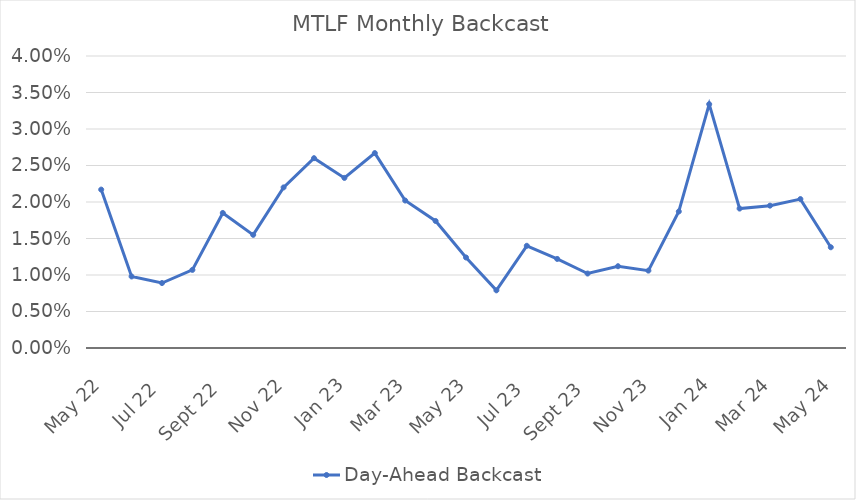
| Category | Day-Ahead Backcast |
|---|---|
| 2022-05-20 | 0.022 |
| 2022-06-20 | 0.01 |
| 2022-07-20 | 0.009 |
| 2022-08-20 | 0.011 |
| 2022-09-20 | 0.018 |
| 2022-10-20 | 0.016 |
| 2022-11-20 | 0.022 |
| 2022-12-20 | 0.026 |
| 2023-01-20 | 0.023 |
| 2023-02-20 | 0.027 |
| 2023-03-20 | 0.02 |
| 2023-04-20 | 0.017 |
| 2023-05-20 | 0.012 |
| 2023-06-20 | 0.008 |
| 2023-07-20 | 0.014 |
| 2023-08-20 | 0.012 |
| 2023-09-20 | 0.01 |
| 2023-10-20 | 0.011 |
| 2023-11-20 | 0.011 |
| 2023-12-20 | 0.019 |
| 2024-01-20 | 0.033 |
| 2024-02-20 | 0.019 |
| 2024-03-20 | 0.02 |
| 2024-04-20 | 0.02 |
| 2024-05-24 | 0.014 |